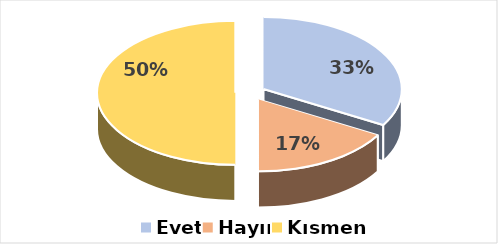
| Category | Evet |
|---|---|
| Evet | 0.333 |
| Hayır | 0.167 |
| Kısmen | 0.5 |